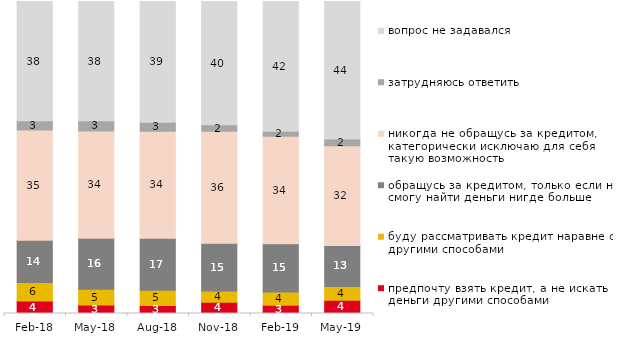
| Category | предпочту взять кредит, а не искать деньги другими способами | буду рассматривать кредит наравне с другими способами | обращусь за кредитом, только если не смогу найти деньги нигде больше | никогда не обращусь за кредитом, категорически исключаю для себя такую возможность | затрудняюсь ответить | вопрос не задавался |
|---|---|---|---|---|---|---|
| 2018-02-01 | 4 | 5.9 | 13.6 | 35.3 | 3 | 38.2 |
| 2018-05-01 | 2.75 | 5.05 | 16.35 | 34.35 | 3.3 | 38.2 |
| 2018-08-01 | 2.55 | 4.9 | 16.7 | 34.25 | 2.9 | 38.7 |
| 2018-11-01 | 3.643 | 3.593 | 15.269 | 35.878 | 2.096 | 39.521 |
| 2019-02-01 | 2.65 | 4.25 | 15.45 | 34.45 | 1.65 | 41.55 |
| 2019-05-01 | 4.21 | 4.458 | 13.125 | 31.947 | 2.229 | 44.032 |